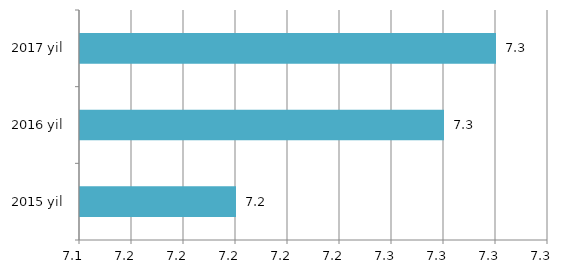
| Category | Series 0 |
|---|---|
| 2015 yil | 7.2 |
| 2016 yil | 7.28 |
| 2017 yil | 7.3 |